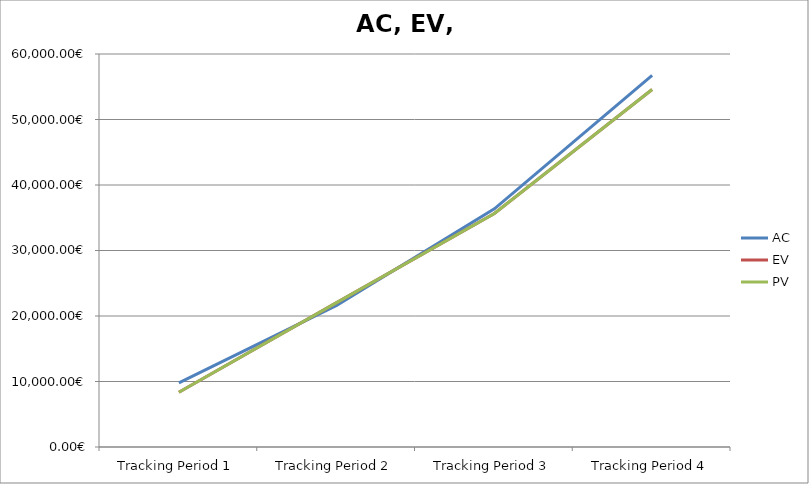
| Category | AC | EV | PV |
|---|---|---|---|
| Tracking Period 1 | 9795.47 | 8362.47 | 8362.47 |
| Tracking Period 2 | 21623.84 | 22035.84 | 22035.84 |
| Tracking Period 3 | 36361.359 | 35655.359 | 35655.359 |
| Tracking Period 4 | 56748.329 | 54580.329 | 54580.329 |